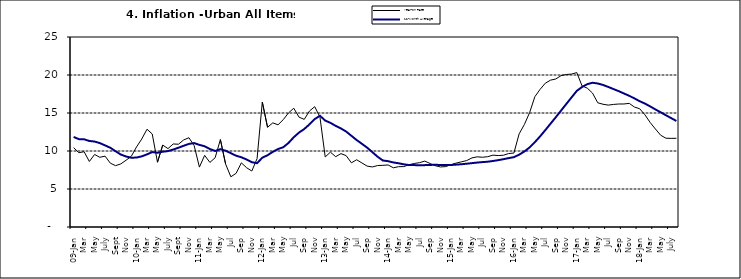
| Category | Year-on Rate | 12-Month Average |
|---|---|---|
| 09-Jan | 10.439 | 11.844 |
| Feb | 9.772 | 11.562 |
| Mar | 9.907 | 11.538 |
| Apr | 8.618 | 11.319 |
| May | 9.547 | 11.246 |
| June | 9.17 | 11.039 |
| July | 9.325 | 10.738 |
| Aug | 8.401 | 10.424 |
| Sept | 8.07 | 9.973 |
| Oct | 8.3 | 9.535 |
| Nov | 8.781 | 9.278 |
| Dec | 9.298 | 9.117 |
| 10-Jan | 10.534 | 9.136 |
| Feb | 11.584 | 9.297 |
| Mar | 12.864 | 9.555 |
| Apr | 12.24 | 9.859 |
| May | 8.524 | 9.769 |
| June | 10.781 | 9.904 |
| July | 10.313 | 9.987 |
| Aug | 10.924 | 10.197 |
| Sept | 10.891 | 10.43 |
| Oct | 11.457 | 10.689 |
| Nov | 11.748 | 10.932 |
| Dec | 10.699 | 11.042 |
| 11-Jan | 7.878 | 10.806 |
| Feb | 9.426 | 10.623 |
| Mar | 8.498 | 10.26 |
| Apr | 9.11 | 10.005 |
| May | 11.5 | 10.249 |
| Jun | 8.278 | 10.034 |
| Jul | 6.608 | 9.711 |
| Aug | 7.061 | 9.38 |
| Sep | 8.443 | 9.178 |
| Oct | 7.802 | 8.88 |
| Nov | 7.365 | 8.525 |
| Dec | 8.993 | 8.395 |
| 12-Jan | 16.445 | 9.119 |
| Feb | 13.123 | 9.443 |
| Mar | 13.701 | 9.889 |
| Apr | 13.447 | 10.259 |
| May | 14.127 | 10.496 |
| Jun | 15.012 | 11.062 |
| Jul | 15.63 | 11.81 |
| Aug | 14.456 | 12.422 |
| Sep | 14.162 | 12.893 |
| Oct | 15.26 | 13.506 |
| Nov | 15.836 | 14.199 |
| Dec | 14.459 | 14.637 |
| 13-Jan | 9.22 | 14.006 |
| Feb | 9.85 | 13.703 |
| Mar | 9.253 | 13.302 |
| Apr | 9.657 | 12.966 |
| May | 9.385 | 12.557 |
| Jun | 8.441 | 11.999 |
| Jul | 8.849 | 11.443 |
| Aug | 8.431 | 10.946 |
| Sep | 8.013 | 10.44 |
| Oct | 7.9 | 9.849 |
| Nov | 8.086 | 9.245 |
| Dec | 8.117 | 8.75 |
| 14-Jan | 8.164 | 8.662 |
| Feb | 7.791 | 8.493 |
| Mar | 7.937 | 8.384 |
| Apr | 7.947 | 8.246 |
| May | 8.195 | 8.151 |
| Jun | 8.358 | 8.146 |
| Jul | 8.464 | 8.118 |
| Aug | 8.673 | 8.141 |
| Sep | 8.357 | 8.17 |
| Oct | 8.064 | 8.182 |
| Nov | 7.902 | 8.165 |
| Dec | 7.948 | 8.151 |
| 15-Jan | 8.211 | 8.155 |
| Feb | 8.412 | 8.206 |
| Mar | 8.579 | 8.26 |
| Apr | 8.742 | 8.326 |
| May | 9.092 | 8.403 |
| Jun | 9.232 | 8.478 |
| Jul | 9.177 | 8.54 |
| Aug | 9.25 | 8.591 |
| Sep | 9.455 | 8.684 |
| Oct | 9.398 | 8.795 |
| Nov | 9.442 | 8.922 |
| Dec | 9.665 | 9.064 |
| 16-Jan | 9.728 | 9.19 |
| Feb | 12.254 | 9.516 |
| Mar | 13.485 | 9.935 |
| Apr | 15.052 | 10.474 |
| May | 17.148 | 11.165 |
| Jun | 18.111 | 11.925 |
| Jul | 18.927 | 12.754 |
| Aug | 19.325 | 13.605 |
| Sep | 19.476 | 14.444 |
| Oct | 19.914 | 15.318 |
| Nov | 20.067 | 16.193 |
| Dec | 20.118 | 17.05 |
| 17-Jan | 20.315 | 17.914 |
| Feb | 18.569 | 18.418 |
| Mar | 18.27 | 18.794 |
| Apr | 17.621 | 18.982 |
| May | 16.343 | 18.883 |
| Jun | 16.153 | 18.692 |
| Jul | 16.038 | 18.43 |
| Aug | 16.128 | 18.151 |
| Sep | 16.183 | 17.872 |
| Oct | 16.187 | 17.567 |
| Nov | 16.267 | 17.264 |
| Dec | 15.785 | 16.921 |
| 18-Jan | 15.559 | 16.55 |
| Feb | 14.763 | 16.241 |
| Mar | 13.748 | 15.866 |
| Apr | 12.893 | 15.468 |
| May | 12.077 | 15.096 |
| June | 11.683 | 14.706 |
| July | 11.661 | 14.329 |
| August | 11.673 | 13.951 |